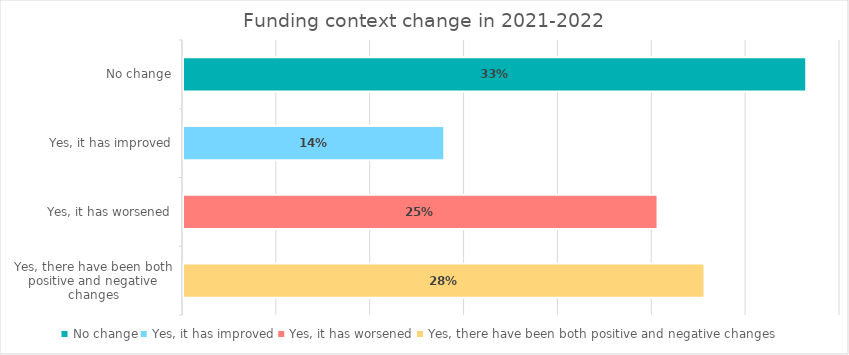
| Category | Series 0 |
|---|---|
| No change | 0.332 |
| Yes, it has improved | 0.139 |
| Yes, it has worsened | 0.253 |
| Yes, there have been both positive and negative changes | 0.278 |